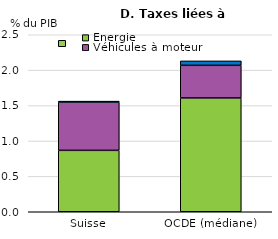
| Category | Énergie | Véhicules à moteur | Autre |
|---|---|---|---|
| Suisse | 0.867 | 0.682 | 0.013 |
| OCDE (médiane) | 1.608 | 0.46 | 0.063 |